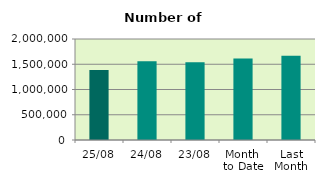
| Category | Series 0 |
|---|---|
| 25/08 | 1386264 |
| 24/08 | 1557750 |
| 23/08 | 1540340 |
| Month 
to Date | 1616123.579 |
| Last
Month | 1667155.619 |